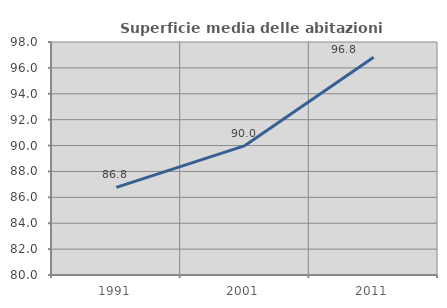
| Category | Superficie media delle abitazioni occupate |
|---|---|
| 1991.0 | 86.764 |
| 2001.0 | 89.998 |
| 2011.0 | 96.826 |